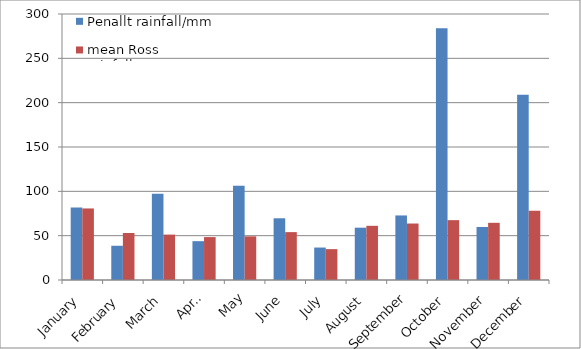
| Category | Penallt rainfall/mm | mean Ross rainfall/mm |
|---|---|---|
| January | 81.8 | 80.7 |
| February | 38.6 | 53 |
| March | 97.2 | 51.2 |
| April | 43.8 | 48.4 |
| May | 106.2 | 49.2 |
| June | 69.6 | 54 |
| July | 36.6 | 34.8 |
| August | 59 | 61.1 |
| September | 72.8 | 63.7 |
| October | 283.8 | 67.5 |
| November | 59.8 | 64.5 |
| December | 208.8 | 78.1 |